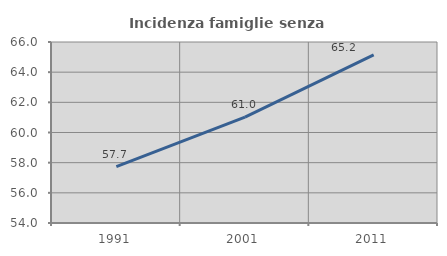
| Category | Incidenza famiglie senza nuclei |
|---|---|
| 1991.0 | 57.732 |
| 2001.0 | 61.017 |
| 2011.0 | 65.152 |